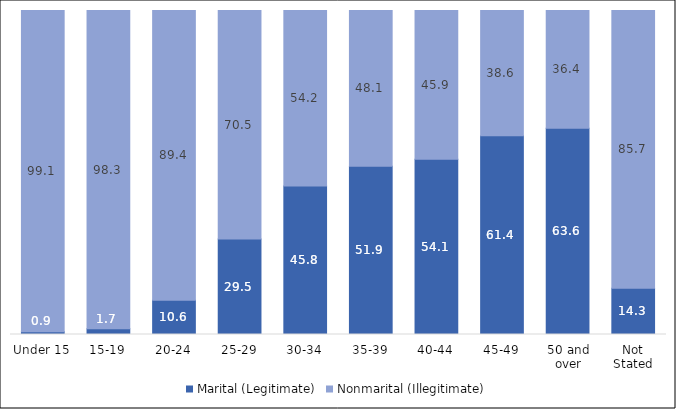
| Category | Marital (Legitimate) | Nonmarital (Illegitimate) |
|---|---|---|
| Under 15 | 0.851 | 99.149 |
| 15-19 | 1.748 | 98.252 |
| 20-24 | 10.584 | 89.416 |
| 25-29 | 29.465 | 70.535 |
| 30-34 | 45.849 | 54.151 |
| 35-39 | 51.916 | 48.084 |
| 40-44 | 54.059 | 45.941 |
| 45-49 | 61.377 | 38.623 |
| 50 and over | 63.636 | 36.364 |
| Not Stated | 14.286 | 85.714 |